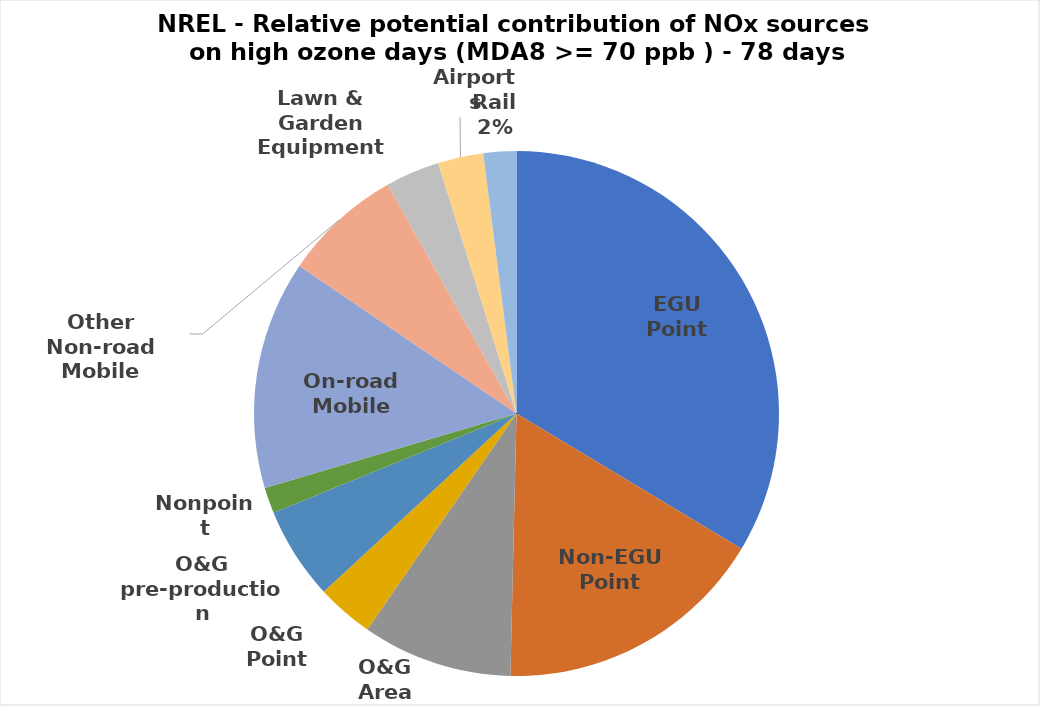
| Category | Total |
|---|---|
| EGU Point | 8152.26 |
| Non-EGU Point | 4065.376 |
| O&G Area | 2244.347 |
| O&G Point | 850.262 |
| O&G pre-production | 1381.156 |
| Nonpoint | 388.546 |
| On-road Mobile | 3414.518 |
| Other Non-road Mobile | 1779.092 |
| Lawn & Garden Equipment | 809.837 |
| Airports | 678.89 |
| Rail | 491.583 |